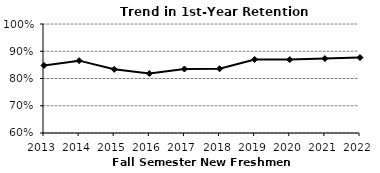
| Category | Series 1 |
|---|---|
| 2013.0 | 0.848 |
| 2014.0 | 0.865 |
| 2015.0 | 0.834 |
| 2016.0 | 0.818 |
| 2017.0 | 0.835 |
| 2018.0 | 0.836 |
| 2019.0 | 0.87 |
| 2020.0 | 0.869 |
| 2021.0 | 0.873 |
| 2022.0 | 0.877 |